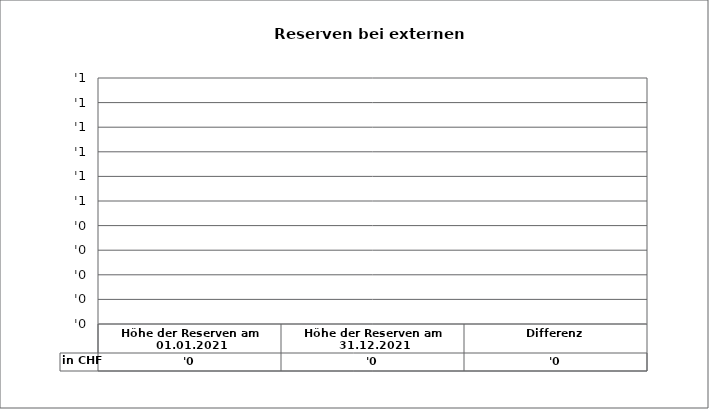
| Category | in CHF |
|---|---|
| Höhe der Reserven am 01.01.2021 | 0 |
| Höhe der Reserven am 31.12.2021 | 0 |
| Differenz | 0 |